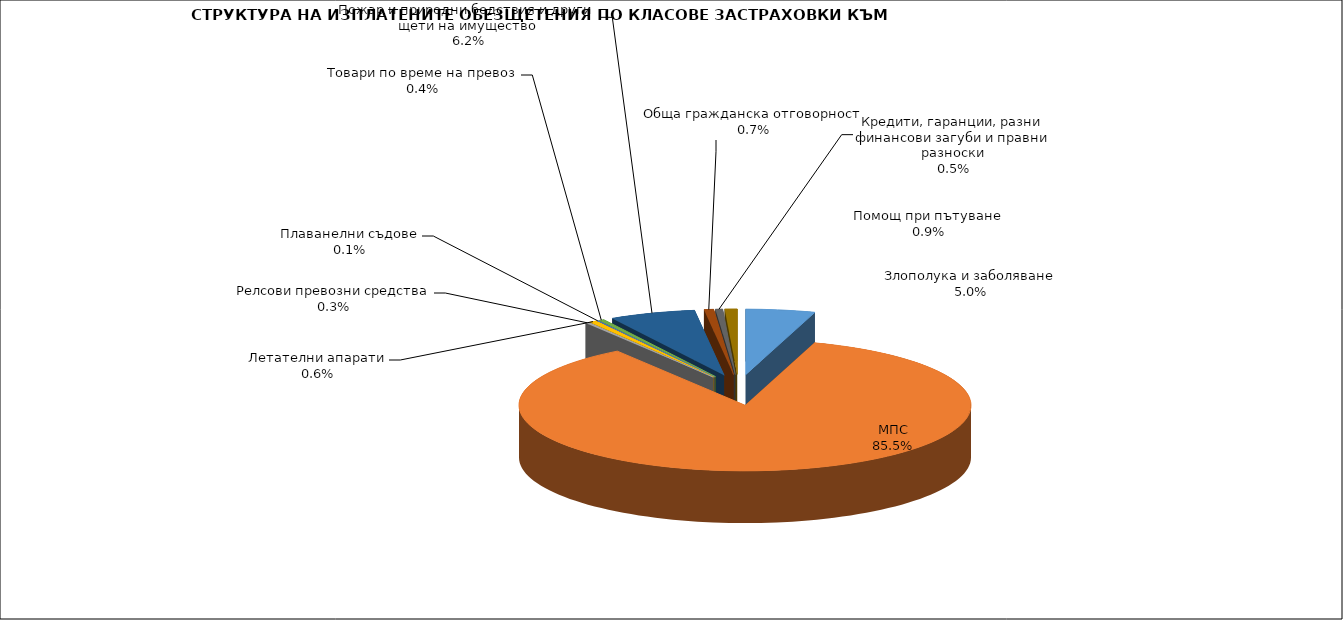
| Category | Series 0 |
|---|---|
| Злополука и заболяване | 0.05 |
| МПС | 0.855 |
| Релсови превозни средства | 0.003 |
| Летателни апарати | 0.006 |
| Плаванелни съдове | 0.001 |
| Товари по време на превоз | 0.004 |
| Пожар и природни бедствия и други щети на имущество | 0.062 |
| Обща гражданска отговорност | 0.007 |
| Кредити, гаранции, разни финансови загуби и правни разноски | 0.005 |
| Помощ при пътуване | 0.009 |